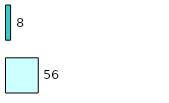
| Category | Series 0 | Series 1 |
|---|---|---|
| 0 | 56 | 8 |